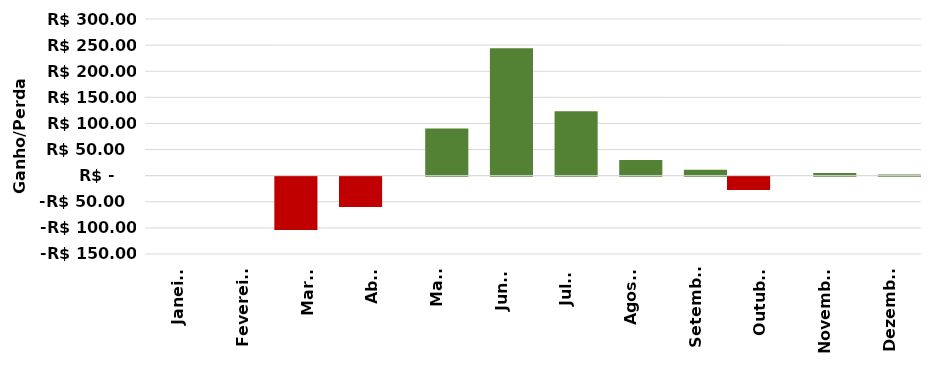
| Category | bneg | bpos |
|---|---|---|
| Janeiro | 0 | 0 |
| Fevereiro | 0 | 0 |
| Março | -102.049 | 0 |
| Abril | -58.036 | 0 |
| Maio | 0 | 90.113 |
| Junho | 0 | 244.224 |
| Julho | 0 | 123.134 |
| Agosto | 0 | 30.099 |
| Setembro | 0 | 11.28 |
| Outubro | -25.733 | 0 |
| Novembro | 0 | 5.154 |
| Dezembro | 0 | 2.2 |